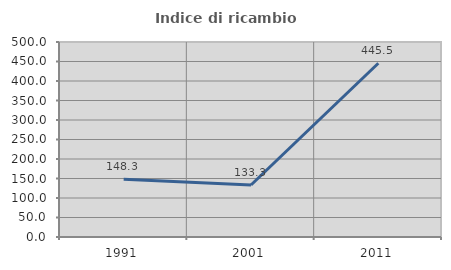
| Category | Indice di ricambio occupazionale  |
|---|---|
| 1991.0 | 148.276 |
| 2001.0 | 133.333 |
| 2011.0 | 445.455 |